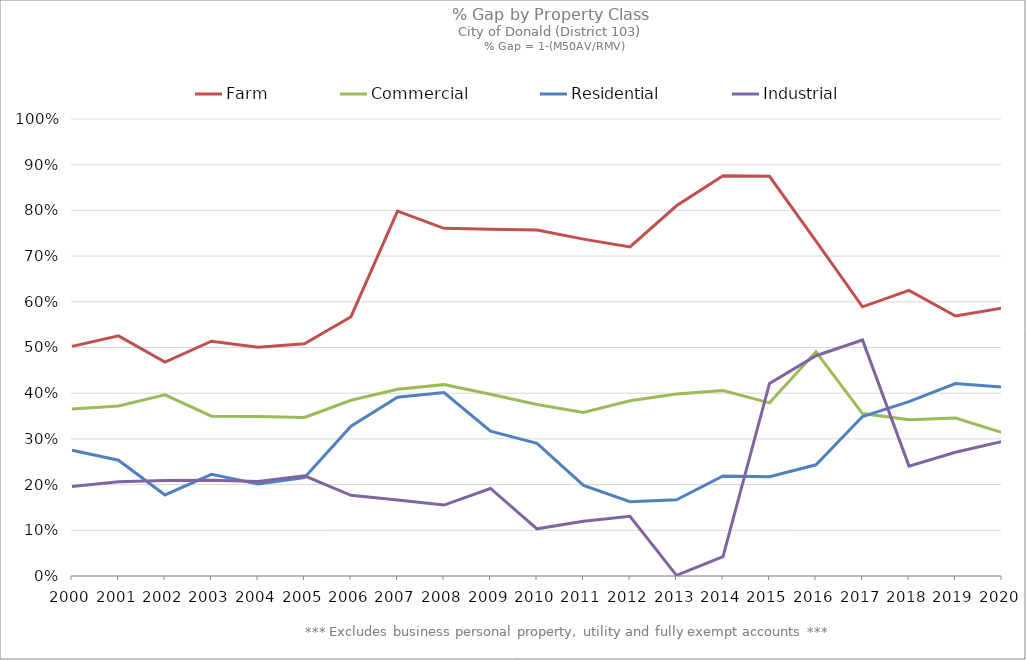
| Category | Farm | Commercial | Residential | Industrial |
|---|---|---|---|---|
| 2000.0 | 0.502 | 0.366 | 0.275 | 0.196 |
| 2001.0 | 0.525 | 0.372 | 0.253 | 0.206 |
| 2002.0 | 0.468 | 0.397 | 0.177 | 0.209 |
| 2003.0 | 0.514 | 0.35 | 0.222 | 0.21 |
| 2004.0 | 0.501 | 0.349 | 0.201 | 0.207 |
| 2005.0 | 0.508 | 0.347 | 0.215 | 0.219 |
| 2006.0 | 0.567 | 0.385 | 0.328 | 0.176 |
| 2007.0 | 0.798 | 0.409 | 0.391 | 0.166 |
| 2008.0 | 0.761 | 0.419 | 0.401 | 0.155 |
| 2009.0 | 0.759 | 0.398 | 0.317 | 0.192 |
| 2010.0 | 0.757 | 0.375 | 0.29 | 0.103 |
| 2011.0 | 0.737 | 0.358 | 0.198 | 0.12 |
| 2012.0 | 0.72 | 0.383 | 0.162 | 0.131 |
| 2013.0 | 0.81 | 0.398 | 0.167 | 0.001 |
| 2014.0 | 0.876 | 0.406 | 0.219 | 0.042 |
| 2015.0 | 0.875 | 0.379 | 0.217 | 0.422 |
| 2016.0 | 0.733 | 0.49 | 0.243 | 0.482 |
| 2017.0 | 0.589 | 0.355 | 0.349 | 0.516 |
| 2018.0 | 0.625 | 0.342 | 0.382 | 0.24 |
| 2019.0 | 0.569 | 0.346 | 0.421 | 0.271 |
| 2020.0 | 0.586 | 0.314 | 0.413 | 0.294 |